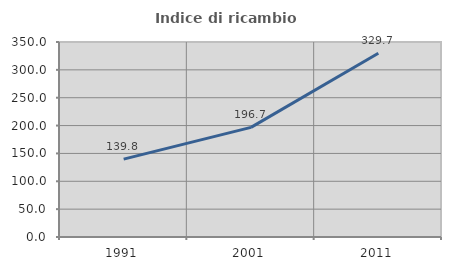
| Category | Indice di ricambio occupazionale  |
|---|---|
| 1991.0 | 139.759 |
| 2001.0 | 196.721 |
| 2011.0 | 329.688 |